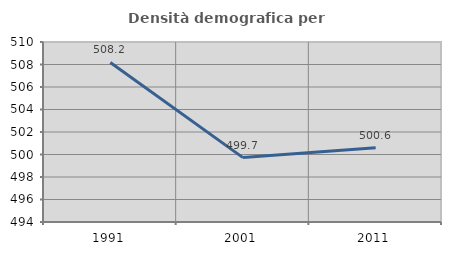
| Category | Densità demografica |
|---|---|
| 1991.0 | 508.18 |
| 2001.0 | 499.723 |
| 2011.0 | 500.598 |